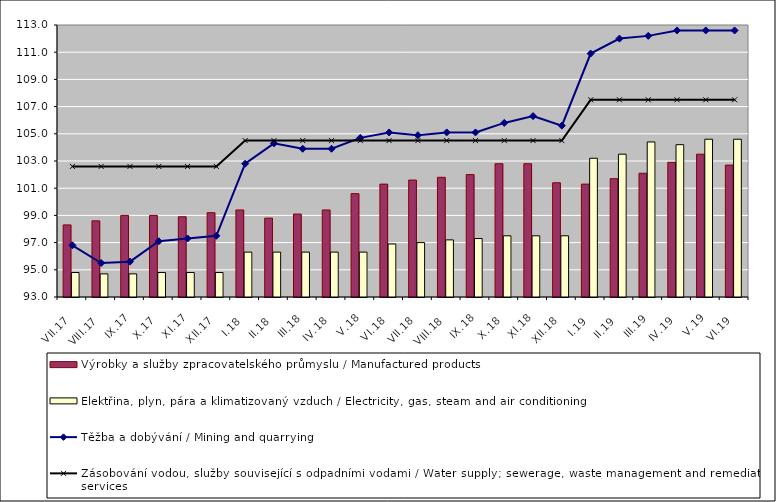
| Category | Výrobky a služby zpracovatelského průmyslu / Manufactured products | Elektřina, plyn, pára a klimatizovaný vzduch / Electricity, gas, steam and air conditioning |
|---|---|---|
| VII.17 | 98.3 | 94.8 |
| VIII.17 | 98.6 | 94.7 |
| IX.17 | 99 | 94.7 |
| X.17 | 99 | 94.8 |
| XI.17 | 98.9 | 94.8 |
| XII.17 | 99.2 | 94.8 |
| I.18 | 99.4 | 96.3 |
| II.18 | 98.8 | 96.3 |
| III.18 | 99.1 | 96.3 |
| IV.18 | 99.4 | 96.3 |
| V.18 | 100.6 | 96.3 |
| VI.18 | 101.3 | 96.9 |
| VII.18 | 101.6 | 97 |
| VIII.18 | 101.8 | 97.2 |
| IX.18 | 102 | 97.3 |
| X.18 | 102.8 | 97.5 |
| XI.18 | 102.8 | 97.5 |
| XII.18 | 101.4 | 97.5 |
| I.19 | 101.3 | 103.2 |
| II.19 | 101.7 | 103.5 |
| III.19 | 102.1 | 104.4 |
| IV.19 | 102.9 | 104.2 |
| V.19 | 103.5 | 104.6 |
| VI.19 | 102.7 | 104.6 |